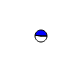
| Category | Series 0 |
|---|---|
| 0 | 1364389 |
| 1 | 1255519 |